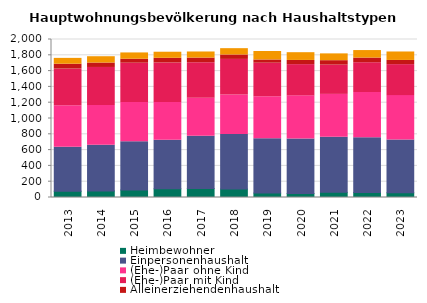
| Category | Heimbewohner | Einpersonenhaushalt | (Ehe-)Paar ohne Kind | (Ehe-)Paar mit Kind | Alleinerziehendenhaushalt | sonstiger Mehrpersonenhaushalt |
|---|---|---|---|---|---|---|
| 2013.0 | 80 | 557 | 524 | 464 | 62 | 74 |
| 2014.0 | 83 | 578 | 503 | 482 | 56 | 80 |
| 2015.0 | 95 | 611 | 497 | 497 | 50 | 80 |
| 2016.0 | 110 | 614 | 479 | 500 | 59 | 77 |
| 2017.0 | 113 | 662 | 482 | 449 | 59 | 77 |
| 2018.0 | 107 | 692 | 497 | 452 | 56 | 80 |
| 2019.0 | 56 | 689 | 530 | 425 | 41 | 107 |
| 2020.0 | 50 | 689 | 548 | 395 | 53 | 98 |
| 2021.0 | 65 | 698 | 542 | 371 | 56 | 86 |
| 2022.0 | 62 | 695 | 572 | 377 | 59 | 95 |
| 2023.0 | 59 | 668 | 563 | 392 | 53 | 107 |